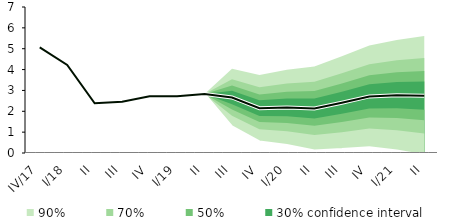
| Category | linka | Střed předpovědi |
|---|---|---|
| IV/17 | 5.062 | 5.062 |
| I/18 | 4.225 | 4.225 |
| II | 2.383 | 2.383 |
| III | 2.458 | 2.458 |
| IV | 2.722 | 2.722 |
| I/19 | 2.721 | 2.721 |
| II | 2.831 | 2.831 |
| III | 2.662 | 2.662 |
| IV | 2.148 | 2.148 |
| I/20 | 2.185 | 2.185 |
| II | 2.137 | 2.137 |
| III | 2.41 | 2.41 |
| IV | 2.714 | 2.714 |
| I/21 | 2.771 | 2.771 |
| II | 2.748 | 2.748 |